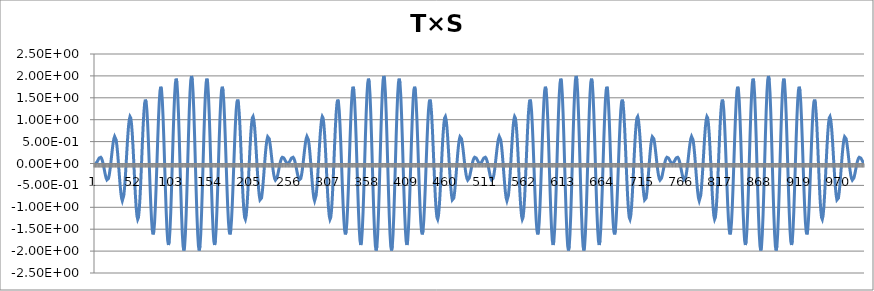
| Category | T×S |
|---|---|
| 0 | 0 |
| 1 | 0.008 |
| 2 | 0.03 |
| 3 | 0.061 |
| 4 | 0.096 |
| 5 | 0.126 |
| 6 | 0.143 |
| 7 | 0.142 |
| 8 | 0.118 |
| 9 | 0.07 |
| 10 | 0 |
| 11 | -0.085 |
| 12 | -0.177 |
| 13 | -0.263 |
| 14 | -0.333 |
| 15 | -0.375 |
| 16 | -0.38 |
| 17 | -0.343 |
| 18 | -0.264 |
| 19 | -0.146 |
| 20 | 0 |
| 21 | 0.161 |
| 22 | 0.321 |
| 23 | 0.461 |
| 24 | 0.565 |
| 25 | 0.618 |
| 26 | 0.61 |
| 27 | 0.539 |
| 28 | 0.405 |
| 29 | 0.22 |
| 30 | 0 |
| 31 | -0.235 |
| 32 | -0.46 |
| 33 | -0.652 |
| 34 | -0.788 |
| 35 | -0.852 |
| 36 | -0.831 |
| 37 | -0.725 |
| 38 | -0.54 |
| 39 | -0.291 |
| 40 | 0 |
| 41 | 0.305 |
| 42 | 0.592 |
| 43 | 0.832 |
| 44 | 0.999 |
| 45 | 1.072 |
| 46 | 1.039 |
| 47 | 0.901 |
| 48 | 0.667 |
| 49 | 0.357 |
| 50 | 0 |
| 51 | -0.37 |
| 52 | -0.715 |
| 53 | -1 |
| 54 | -1.194 |
| 55 | -1.275 |
| 56 | -1.231 |
| 57 | -1.062 |
| 58 | -0.783 |
| 59 | -0.417 |
| 60 | 0 |
| 61 | 0.429 |
| 62 | 0.826 |
| 63 | 1.151 |
| 64 | 1.37 |
| 65 | 1.458 |
| 66 | 1.403 |
| 67 | 1.207 |
| 68 | 0.887 |
| 69 | 0.471 |
| 70 | 0 |
| 71 | -0.481 |
| 72 | -0.924 |
| 73 | -1.285 |
| 74 | -1.525 |
| 75 | -1.618 |
| 76 | -1.553 |
| 77 | -1.333 |
| 78 | -0.976 |
| 79 | -0.518 |
| 80 | 0 |
| 81 | 0.526 |
| 82 | 1.008 |
| 83 | 1.398 |
| 84 | 1.655 |
| 85 | 1.753 |
| 86 | 1.678 |
| 87 | 1.437 |
| 88 | 1.051 |
| 89 | 0.556 |
| 90 | 0 |
| 91 | -0.562 |
| 92 | -1.076 |
| 93 | -1.489 |
| 94 | -1.76 |
| 95 | -1.86 |
| 96 | -1.777 |
| 97 | -1.519 |
| 98 | -1.109 |
| 99 | -0.585 |
| 100 | 0 |
| 101 | 0.59 |
| 102 | 1.127 |
| 103 | 1.557 |
| 104 | 1.836 |
| 105 | 1.937 |
| 106 | 1.848 |
| 107 | 1.577 |
| 108 | 1.149 |
| 109 | 0.606 |
| 110 | 0 |
| 111 | -0.608 |
| 112 | -1.16 |
| 113 | -1.6 |
| 114 | -1.884 |
| 115 | -1.984 |
| 116 | -1.89 |
| 117 | -1.61 |
| 118 | -1.171 |
| 119 | -0.616 |
| 120 | 0 |
| 121 | 0.617 |
| 122 | 1.175 |
| 123 | 1.618 |
| 124 | 1.902 |
| 125 | 2 |
| 126 | 1.902 |
| 127 | 1.618 |
| 128 | 1.175 |
| 129 | 0.617 |
| 130 | 0 |
| 131 | -0.616 |
| 132 | -1.171 |
| 133 | -1.61 |
| 134 | -1.89 |
| 135 | -1.984 |
| 136 | -1.884 |
| 137 | -1.6 |
| 138 | -1.16 |
| 139 | -0.608 |
| 140 | 0 |
| 141 | 0.606 |
| 142 | 1.149 |
| 143 | 1.577 |
| 144 | 1.848 |
| 145 | 1.937 |
| 146 | 1.836 |
| 147 | 1.557 |
| 148 | 1.127 |
| 149 | 0.59 |
| 150 | 0 |
| 151 | -0.585 |
| 152 | -1.109 |
| 153 | -1.519 |
| 154 | -1.777 |
| 155 | -1.86 |
| 156 | -1.76 |
| 157 | -1.489 |
| 158 | -1.076 |
| 159 | -0.562 |
| 160 | 0 |
| 161 | 0.556 |
| 162 | 1.051 |
| 163 | 1.437 |
| 164 | 1.678 |
| 165 | 1.753 |
| 166 | 1.655 |
| 167 | 1.398 |
| 168 | 1.008 |
| 169 | 0.526 |
| 170 | 0 |
| 171 | -0.518 |
| 172 | -0.976 |
| 173 | -1.333 |
| 174 | -1.553 |
| 175 | -1.618 |
| 176 | -1.525 |
| 177 | -1.285 |
| 178 | -0.924 |
| 179 | -0.481 |
| 180 | 0 |
| 181 | 0.471 |
| 182 | 0.887 |
| 183 | 1.207 |
| 184 | 1.403 |
| 185 | 1.458 |
| 186 | 1.37 |
| 187 | 1.151 |
| 188 | 0.826 |
| 189 | 0.429 |
| 190 | 0 |
| 191 | -0.417 |
| 192 | -0.783 |
| 193 | -1.062 |
| 194 | -1.231 |
| 195 | -1.275 |
| 196 | -1.194 |
| 197 | -1 |
| 198 | -0.715 |
| 199 | -0.37 |
| 200 | 0 |
| 201 | 0.357 |
| 202 | 0.667 |
| 203 | 0.901 |
| 204 | 1.039 |
| 205 | 1.072 |
| 206 | 0.999 |
| 207 | 0.832 |
| 208 | 0.592 |
| 209 | 0.305 |
| 210 | 0 |
| 211 | -0.291 |
| 212 | -0.54 |
| 213 | -0.725 |
| 214 | -0.831 |
| 215 | -0.852 |
| 216 | -0.788 |
| 217 | -0.652 |
| 218 | -0.46 |
| 219 | -0.235 |
| 220 | 0 |
| 221 | 0.22 |
| 222 | 0.405 |
| 223 | 0.539 |
| 224 | 0.61 |
| 225 | 0.618 |
| 226 | 0.565 |
| 227 | 0.461 |
| 228 | 0.321 |
| 229 | 0.161 |
| 230 | 0 |
| 231 | -0.146 |
| 232 | -0.264 |
| 233 | -0.343 |
| 234 | -0.38 |
| 235 | -0.375 |
| 236 | -0.333 |
| 237 | -0.263 |
| 238 | -0.177 |
| 239 | -0.085 |
| 240 | 0 |
| 241 | 0.07 |
| 242 | 0.118 |
| 243 | 0.142 |
| 244 | 0.143 |
| 245 | 0.126 |
| 246 | 0.096 |
| 247 | 0.061 |
| 248 | 0.03 |
| 249 | 0.008 |
| 250 | 0 |
| 251 | 0.008 |
| 252 | 0.03 |
| 253 | 0.061 |
| 254 | 0.096 |
| 255 | 0.126 |
| 256 | 0.143 |
| 257 | 0.142 |
| 258 | 0.118 |
| 259 | 0.07 |
| 260 | 0 |
| 261 | -0.085 |
| 262 | -0.177 |
| 263 | -0.263 |
| 264 | -0.333 |
| 265 | -0.375 |
| 266 | -0.38 |
| 267 | -0.343 |
| 268 | -0.264 |
| 269 | -0.146 |
| 270 | 0 |
| 271 | 0.161 |
| 272 | 0.321 |
| 273 | 0.461 |
| 274 | 0.565 |
| 275 | 0.618 |
| 276 | 0.61 |
| 277 | 0.539 |
| 278 | 0.405 |
| 279 | 0.22 |
| 280 | 0 |
| 281 | -0.235 |
| 282 | -0.46 |
| 283 | -0.652 |
| 284 | -0.788 |
| 285 | -0.852 |
| 286 | -0.831 |
| 287 | -0.725 |
| 288 | -0.54 |
| 289 | -0.291 |
| 290 | 0 |
| 291 | 0.305 |
| 292 | 0.592 |
| 293 | 0.832 |
| 294 | 0.999 |
| 295 | 1.072 |
| 296 | 1.039 |
| 297 | 0.901 |
| 298 | 0.667 |
| 299 | 0.357 |
| 300 | 0 |
| 301 | -0.37 |
| 302 | -0.715 |
| 303 | -1 |
| 304 | -1.194 |
| 305 | -1.275 |
| 306 | -1.231 |
| 307 | -1.062 |
| 308 | -0.783 |
| 309 | -0.417 |
| 310 | 0 |
| 311 | 0.429 |
| 312 | 0.826 |
| 313 | 1.151 |
| 314 | 1.37 |
| 315 | 1.458 |
| 316 | 1.403 |
| 317 | 1.207 |
| 318 | 0.887 |
| 319 | 0.471 |
| 320 | 0 |
| 321 | -0.481 |
| 322 | -0.924 |
| 323 | -1.285 |
| 324 | -1.525 |
| 325 | -1.618 |
| 326 | -1.553 |
| 327 | -1.333 |
| 328 | -0.976 |
| 329 | -0.518 |
| 330 | 0 |
| 331 | 0.526 |
| 332 | 1.008 |
| 333 | 1.398 |
| 334 | 1.655 |
| 335 | 1.753 |
| 336 | 1.678 |
| 337 | 1.437 |
| 338 | 1.051 |
| 339 | 0.556 |
| 340 | 0 |
| 341 | -0.562 |
| 342 | -1.076 |
| 343 | -1.489 |
| 344 | -1.76 |
| 345 | -1.86 |
| 346 | -1.777 |
| 347 | -1.519 |
| 348 | -1.109 |
| 349 | -0.585 |
| 350 | 0 |
| 351 | 0.59 |
| 352 | 1.127 |
| 353 | 1.557 |
| 354 | 1.836 |
| 355 | 1.937 |
| 356 | 1.848 |
| 357 | 1.577 |
| 358 | 1.149 |
| 359 | 0.606 |
| 360 | 0 |
| 361 | -0.608 |
| 362 | -1.16 |
| 363 | -1.6 |
| 364 | -1.884 |
| 365 | -1.984 |
| 366 | -1.89 |
| 367 | -1.61 |
| 368 | -1.171 |
| 369 | -0.616 |
| 370 | 0 |
| 371 | 0.617 |
| 372 | 1.175 |
| 373 | 1.618 |
| 374 | 1.902 |
| 375 | 2 |
| 376 | 1.902 |
| 377 | 1.618 |
| 378 | 1.175 |
| 379 | 0.617 |
| 380 | 0 |
| 381 | -0.616 |
| 382 | -1.171 |
| 383 | -1.61 |
| 384 | -1.89 |
| 385 | -1.984 |
| 386 | -1.884 |
| 387 | -1.6 |
| 388 | -1.16 |
| 389 | -0.608 |
| 390 | 0 |
| 391 | 0.606 |
| 392 | 1.149 |
| 393 | 1.577 |
| 394 | 1.848 |
| 395 | 1.937 |
| 396 | 1.836 |
| 397 | 1.557 |
| 398 | 1.127 |
| 399 | 0.59 |
| 400 | 0 |
| 401 | -0.585 |
| 402 | -1.109 |
| 403 | -1.519 |
| 404 | -1.777 |
| 405 | -1.86 |
| 406 | -1.76 |
| 407 | -1.489 |
| 408 | -1.076 |
| 409 | -0.562 |
| 410 | 0 |
| 411 | 0.556 |
| 412 | 1.051 |
| 413 | 1.437 |
| 414 | 1.678 |
| 415 | 1.753 |
| 416 | 1.655 |
| 417 | 1.398 |
| 418 | 1.008 |
| 419 | 0.526 |
| 420 | 0 |
| 421 | -0.518 |
| 422 | -0.976 |
| 423 | -1.333 |
| 424 | -1.553 |
| 425 | -1.618 |
| 426 | -1.525 |
| 427 | -1.285 |
| 428 | -0.924 |
| 429 | -0.481 |
| 430 | 0 |
| 431 | 0.471 |
| 432 | 0.887 |
| 433 | 1.207 |
| 434 | 1.403 |
| 435 | 1.458 |
| 436 | 1.37 |
| 437 | 1.151 |
| 438 | 0.826 |
| 439 | 0.429 |
| 440 | 0 |
| 441 | -0.417 |
| 442 | -0.783 |
| 443 | -1.062 |
| 444 | -1.231 |
| 445 | -1.275 |
| 446 | -1.194 |
| 447 | -1 |
| 448 | -0.715 |
| 449 | -0.37 |
| 450 | 0 |
| 451 | 0.357 |
| 452 | 0.667 |
| 453 | 0.901 |
| 454 | 1.039 |
| 455 | 1.072 |
| 456 | 0.999 |
| 457 | 0.832 |
| 458 | 0.592 |
| 459 | 0.305 |
| 460 | 0 |
| 461 | -0.291 |
| 462 | -0.54 |
| 463 | -0.725 |
| 464 | -0.831 |
| 465 | -0.852 |
| 466 | -0.788 |
| 467 | -0.652 |
| 468 | -0.46 |
| 469 | -0.235 |
| 470 | 0 |
| 471 | 0.22 |
| 472 | 0.405 |
| 473 | 0.539 |
| 474 | 0.61 |
| 475 | 0.618 |
| 476 | 0.565 |
| 477 | 0.461 |
| 478 | 0.321 |
| 479 | 0.161 |
| 480 | 0 |
| 481 | -0.146 |
| 482 | -0.264 |
| 483 | -0.343 |
| 484 | -0.38 |
| 485 | -0.375 |
| 486 | -0.333 |
| 487 | -0.263 |
| 488 | -0.177 |
| 489 | -0.085 |
| 490 | 0 |
| 491 | 0.07 |
| 492 | 0.118 |
| 493 | 0.142 |
| 494 | 0.143 |
| 495 | 0.126 |
| 496 | 0.096 |
| 497 | 0.061 |
| 498 | 0.03 |
| 499 | 0.008 |
| 500 | 0 |
| 501 | 0.008 |
| 502 | 0.03 |
| 503 | 0.061 |
| 504 | 0.096 |
| 505 | 0.126 |
| 506 | 0.143 |
| 507 | 0.142 |
| 508 | 0.118 |
| 509 | 0.07 |
| 510 | 0 |
| 511 | -0.085 |
| 512 | -0.177 |
| 513 | -0.263 |
| 514 | -0.333 |
| 515 | -0.375 |
| 516 | -0.38 |
| 517 | -0.343 |
| 518 | -0.264 |
| 519 | -0.146 |
| 520 | 0 |
| 521 | 0.161 |
| 522 | 0.321 |
| 523 | 0.461 |
| 524 | 0.565 |
| 525 | 0.618 |
| 526 | 0.61 |
| 527 | 0.539 |
| 528 | 0.405 |
| 529 | 0.22 |
| 530 | 0 |
| 531 | -0.235 |
| 532 | -0.46 |
| 533 | -0.652 |
| 534 | -0.788 |
| 535 | -0.852 |
| 536 | -0.831 |
| 537 | -0.725 |
| 538 | -0.54 |
| 539 | -0.291 |
| 540 | 0 |
| 541 | 0.305 |
| 542 | 0.592 |
| 543 | 0.832 |
| 544 | 0.999 |
| 545 | 1.072 |
| 546 | 1.039 |
| 547 | 0.901 |
| 548 | 0.667 |
| 549 | 0.357 |
| 550 | 0 |
| 551 | -0.37 |
| 552 | -0.715 |
| 553 | -1 |
| 554 | -1.194 |
| 555 | -1.275 |
| 556 | -1.231 |
| 557 | -1.062 |
| 558 | -0.783 |
| 559 | -0.417 |
| 560 | 0 |
| 561 | 0.429 |
| 562 | 0.826 |
| 563 | 1.151 |
| 564 | 1.37 |
| 565 | 1.458 |
| 566 | 1.403 |
| 567 | 1.207 |
| 568 | 0.887 |
| 569 | 0.471 |
| 570 | 0 |
| 571 | -0.481 |
| 572 | -0.924 |
| 573 | -1.285 |
| 574 | -1.525 |
| 575 | -1.618 |
| 576 | -1.553 |
| 577 | -1.333 |
| 578 | -0.976 |
| 579 | -0.518 |
| 580 | 0 |
| 581 | 0.526 |
| 582 | 1.008 |
| 583 | 1.398 |
| 584 | 1.655 |
| 585 | 1.753 |
| 586 | 1.678 |
| 587 | 1.437 |
| 588 | 1.051 |
| 589 | 0.556 |
| 590 | 0 |
| 591 | -0.562 |
| 592 | -1.076 |
| 593 | -1.489 |
| 594 | -1.76 |
| 595 | -1.86 |
| 596 | -1.777 |
| 597 | -1.519 |
| 598 | -1.109 |
| 599 | -0.585 |
| 600 | 0 |
| 601 | 0.59 |
| 602 | 1.127 |
| 603 | 1.557 |
| 604 | 1.836 |
| 605 | 1.937 |
| 606 | 1.848 |
| 607 | 1.577 |
| 608 | 1.149 |
| 609 | 0.606 |
| 610 | 0 |
| 611 | -0.608 |
| 612 | -1.16 |
| 613 | -1.6 |
| 614 | -1.884 |
| 615 | -1.984 |
| 616 | -1.89 |
| 617 | -1.61 |
| 618 | -1.171 |
| 619 | -0.616 |
| 620 | 0 |
| 621 | 0.617 |
| 622 | 1.175 |
| 623 | 1.618 |
| 624 | 1.902 |
| 625 | 2 |
| 626 | 1.902 |
| 627 | 1.618 |
| 628 | 1.175 |
| 629 | 0.617 |
| 630 | 0 |
| 631 | -0.616 |
| 632 | -1.171 |
| 633 | -1.61 |
| 634 | -1.89 |
| 635 | -1.984 |
| 636 | -1.884 |
| 637 | -1.6 |
| 638 | -1.16 |
| 639 | -0.608 |
| 640 | 0 |
| 641 | 0.606 |
| 642 | 1.149 |
| 643 | 1.577 |
| 644 | 1.848 |
| 645 | 1.937 |
| 646 | 1.836 |
| 647 | 1.557 |
| 648 | 1.127 |
| 649 | 0.59 |
| 650 | 0 |
| 651 | -0.585 |
| 652 | -1.109 |
| 653 | -1.519 |
| 654 | -1.777 |
| 655 | -1.86 |
| 656 | -1.76 |
| 657 | -1.489 |
| 658 | -1.076 |
| 659 | -0.562 |
| 660 | 0 |
| 661 | 0.556 |
| 662 | 1.051 |
| 663 | 1.437 |
| 664 | 1.678 |
| 665 | 1.753 |
| 666 | 1.655 |
| 667 | 1.398 |
| 668 | 1.008 |
| 669 | 0.526 |
| 670 | 0 |
| 671 | -0.518 |
| 672 | -0.976 |
| 673 | -1.333 |
| 674 | -1.553 |
| 675 | -1.618 |
| 676 | -1.525 |
| 677 | -1.285 |
| 678 | -0.924 |
| 679 | -0.481 |
| 680 | 0 |
| 681 | 0.471 |
| 682 | 0.887 |
| 683 | 1.207 |
| 684 | 1.403 |
| 685 | 1.458 |
| 686 | 1.37 |
| 687 | 1.151 |
| 688 | 0.826 |
| 689 | 0.429 |
| 690 | 0 |
| 691 | -0.417 |
| 692 | -0.783 |
| 693 | -1.062 |
| 694 | -1.231 |
| 695 | -1.275 |
| 696 | -1.194 |
| 697 | -1 |
| 698 | -0.715 |
| 699 | -0.37 |
| 700 | 0 |
| 701 | 0.357 |
| 702 | 0.667 |
| 703 | 0.901 |
| 704 | 1.039 |
| 705 | 1.072 |
| 706 | 0.999 |
| 707 | 0.832 |
| 708 | 0.592 |
| 709 | 0.305 |
| 710 | 0 |
| 711 | -0.291 |
| 712 | -0.54 |
| 713 | -0.725 |
| 714 | -0.831 |
| 715 | -0.852 |
| 716 | -0.788 |
| 717 | -0.652 |
| 718 | -0.46 |
| 719 | -0.235 |
| 720 | 0 |
| 721 | 0.22 |
| 722 | 0.405 |
| 723 | 0.539 |
| 724 | 0.61 |
| 725 | 0.618 |
| 726 | 0.565 |
| 727 | 0.461 |
| 728 | 0.321 |
| 729 | 0.161 |
| 730 | 0 |
| 731 | -0.146 |
| 732 | -0.264 |
| 733 | -0.343 |
| 734 | -0.38 |
| 735 | -0.375 |
| 736 | -0.333 |
| 737 | -0.263 |
| 738 | -0.177 |
| 739 | -0.085 |
| 740 | 0 |
| 741 | 0.07 |
| 742 | 0.118 |
| 743 | 0.142 |
| 744 | 0.143 |
| 745 | 0.126 |
| 746 | 0.096 |
| 747 | 0.061 |
| 748 | 0.03 |
| 749 | 0.008 |
| 750 | 0 |
| 751 | 0.008 |
| 752 | 0.03 |
| 753 | 0.061 |
| 754 | 0.096 |
| 755 | 0.126 |
| 756 | 0.143 |
| 757 | 0.142 |
| 758 | 0.118 |
| 759 | 0.07 |
| 760 | 0 |
| 761 | -0.085 |
| 762 | -0.177 |
| 763 | -0.263 |
| 764 | -0.333 |
| 765 | -0.375 |
| 766 | -0.38 |
| 767 | -0.343 |
| 768 | -0.264 |
| 769 | -0.146 |
| 770 | 0 |
| 771 | 0.161 |
| 772 | 0.321 |
| 773 | 0.461 |
| 774 | 0.565 |
| 775 | 0.618 |
| 776 | 0.61 |
| 777 | 0.539 |
| 778 | 0.405 |
| 779 | 0.22 |
| 780 | 0 |
| 781 | -0.235 |
| 782 | -0.46 |
| 783 | -0.652 |
| 784 | -0.788 |
| 785 | -0.852 |
| 786 | -0.831 |
| 787 | -0.725 |
| 788 | -0.54 |
| 789 | -0.291 |
| 790 | 0 |
| 791 | 0.305 |
| 792 | 0.592 |
| 793 | 0.832 |
| 794 | 0.999 |
| 795 | 1.072 |
| 796 | 1.039 |
| 797 | 0.901 |
| 798 | 0.667 |
| 799 | 0.357 |
| 800 | 0 |
| 801 | -0.37 |
| 802 | -0.715 |
| 803 | -1 |
| 804 | -1.194 |
| 805 | -1.275 |
| 806 | -1.231 |
| 807 | -1.062 |
| 808 | -0.783 |
| 809 | -0.417 |
| 810 | 0 |
| 811 | 0.429 |
| 812 | 0.826 |
| 813 | 1.151 |
| 814 | 1.37 |
| 815 | 1.458 |
| 816 | 1.403 |
| 817 | 1.207 |
| 818 | 0.887 |
| 819 | 0.471 |
| 820 | 0 |
| 821 | -0.481 |
| 822 | -0.924 |
| 823 | -1.285 |
| 824 | -1.525 |
| 825 | -1.618 |
| 826 | -1.553 |
| 827 | -1.333 |
| 828 | -0.976 |
| 829 | -0.518 |
| 830 | 0 |
| 831 | 0.526 |
| 832 | 1.008 |
| 833 | 1.398 |
| 834 | 1.655 |
| 835 | 1.753 |
| 836 | 1.678 |
| 837 | 1.437 |
| 838 | 1.051 |
| 839 | 0.556 |
| 840 | 0 |
| 841 | -0.562 |
| 842 | -1.076 |
| 843 | -1.489 |
| 844 | -1.76 |
| 845 | -1.86 |
| 846 | -1.777 |
| 847 | -1.519 |
| 848 | -1.109 |
| 849 | -0.585 |
| 850 | 0 |
| 851 | 0.59 |
| 852 | 1.127 |
| 853 | 1.557 |
| 854 | 1.836 |
| 855 | 1.937 |
| 856 | 1.848 |
| 857 | 1.577 |
| 858 | 1.149 |
| 859 | 0.606 |
| 860 | 0 |
| 861 | -0.608 |
| 862 | -1.16 |
| 863 | -1.6 |
| 864 | -1.884 |
| 865 | -1.984 |
| 866 | -1.89 |
| 867 | -1.61 |
| 868 | -1.171 |
| 869 | -0.616 |
| 870 | 0 |
| 871 | 0.617 |
| 872 | 1.175 |
| 873 | 1.618 |
| 874 | 1.902 |
| 875 | 2 |
| 876 | 1.902 |
| 877 | 1.618 |
| 878 | 1.175 |
| 879 | 0.617 |
| 880 | 0 |
| 881 | -0.616 |
| 882 | -1.171 |
| 883 | -1.61 |
| 884 | -1.89 |
| 885 | -1.984 |
| 886 | -1.884 |
| 887 | -1.6 |
| 888 | -1.16 |
| 889 | -0.608 |
| 890 | 0 |
| 891 | 0.606 |
| 892 | 1.149 |
| 893 | 1.577 |
| 894 | 1.848 |
| 895 | 1.937 |
| 896 | 1.836 |
| 897 | 1.557 |
| 898 | 1.127 |
| 899 | 0.59 |
| 900 | 0 |
| 901 | -0.585 |
| 902 | -1.109 |
| 903 | -1.519 |
| 904 | -1.777 |
| 905 | -1.86 |
| 906 | -1.76 |
| 907 | -1.489 |
| 908 | -1.076 |
| 909 | -0.562 |
| 910 | 0 |
| 911 | 0.556 |
| 912 | 1.051 |
| 913 | 1.437 |
| 914 | 1.678 |
| 915 | 1.753 |
| 916 | 1.655 |
| 917 | 1.398 |
| 918 | 1.008 |
| 919 | 0.526 |
| 920 | 0 |
| 921 | -0.518 |
| 922 | -0.976 |
| 923 | -1.333 |
| 924 | -1.553 |
| 925 | -1.618 |
| 926 | -1.525 |
| 927 | -1.285 |
| 928 | -0.924 |
| 929 | -0.481 |
| 930 | 0 |
| 931 | 0.471 |
| 932 | 0.887 |
| 933 | 1.207 |
| 934 | 1.403 |
| 935 | 1.458 |
| 936 | 1.37 |
| 937 | 1.151 |
| 938 | 0.826 |
| 939 | 0.429 |
| 940 | 0 |
| 941 | -0.417 |
| 942 | -0.783 |
| 943 | -1.062 |
| 944 | -1.231 |
| 945 | -1.275 |
| 946 | -1.194 |
| 947 | -1 |
| 948 | -0.715 |
| 949 | -0.37 |
| 950 | 0 |
| 951 | 0.357 |
| 952 | 0.667 |
| 953 | 0.901 |
| 954 | 1.039 |
| 955 | 1.072 |
| 956 | 0.999 |
| 957 | 0.832 |
| 958 | 0.592 |
| 959 | 0.305 |
| 960 | 0 |
| 961 | -0.291 |
| 962 | -0.54 |
| 963 | -0.725 |
| 964 | -0.831 |
| 965 | -0.852 |
| 966 | -0.788 |
| 967 | -0.652 |
| 968 | -0.46 |
| 969 | -0.235 |
| 970 | 0 |
| 971 | 0.22 |
| 972 | 0.405 |
| 973 | 0.539 |
| 974 | 0.61 |
| 975 | 0.618 |
| 976 | 0.565 |
| 977 | 0.461 |
| 978 | 0.321 |
| 979 | 0.161 |
| 980 | 0 |
| 981 | -0.146 |
| 982 | -0.264 |
| 983 | -0.343 |
| 984 | -0.38 |
| 985 | -0.375 |
| 986 | -0.333 |
| 987 | -0.263 |
| 988 | -0.177 |
| 989 | -0.085 |
| 990 | 0 |
| 991 | 0.07 |
| 992 | 0.118 |
| 993 | 0.142 |
| 994 | 0.143 |
| 995 | 0.126 |
| 996 | 0.096 |
| 997 | 0.061 |
| 998 | 0.03 |
| 999 | 0.008 |
| 1000 | 0 |